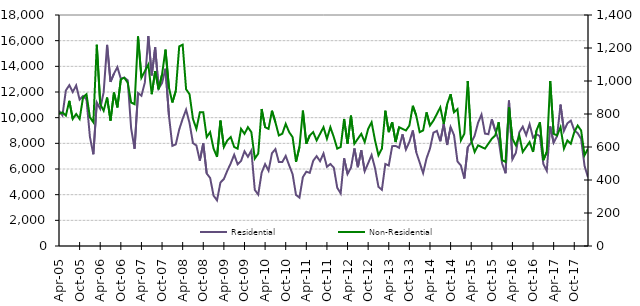
| Category | Residential |
|---|---|
| 2005-04-01 | 10540 |
| 2005-05-01 | 10180 |
| 2005-06-01 | 12120 |
| 2005-07-01 | 12530 |
| 2005-08-01 | 12000 |
| 2005-09-01 | 12510 |
| 2005-10-01 | 11410 |
| 2005-11-01 | 11690 |
| 2005-12-01 | 11430 |
| 2006-01-01 | 8500 |
| 2006-02-01 | 7150 |
| 2006-03-01 | 11180 |
| 2006-04-01 | 10690 |
| 2006-05-01 | 11990 |
| 2006-06-01 | 15670 |
| 2006-07-01 | 12790 |
| 2006-08-01 | 13430 |
| 2006-09-01 | 13930 |
| 2006-10-01 | 13030 |
| 2006-11-01 | 13120 |
| 2006-12-01 | 12920 |
| 2007-01-01 | 9170 |
| 2007-02-01 | 7580 |
| 2007-03-01 | 11920 |
| 2007-04-01 | 11700 |
| 2007-05-01 | 12750 |
| 2007-06-01 | 16360 |
| 2007-07-01 | 13290 |
| 2007-08-01 | 15480 |
| 2007-09-01 | 12270 |
| 2007-10-01 | 12700 |
| 2007-11-01 | 13810 |
| 2007-12-01 | 10180 |
| 2008-01-01 | 7800 |
| 2008-02-01 | 7920 |
| 2008-03-01 | 9080 |
| 2008-04-01 | 9910 |
| 2008-05-01 | 10620 |
| 2008-06-01 | 9580 |
| 2008-07-01 | 8020 |
| 2008-08-01 | 7830 |
| 2008-09-01 | 6650 |
| 2008-10-01 | 8000 |
| 2008-11-01 | 5650 |
| 2008-12-01 | 5300 |
| 2009-01-01 | 3920 |
| 2009-02-01 | 3560 |
| 2009-03-01 | 4950 |
| 2009-04-01 | 5220 |
| 2009-05-01 | 5870 |
| 2009-06-01 | 6440 |
| 2009-07-01 | 7110 |
| 2009-08-01 | 6370 |
| 2009-09-01 | 6630 |
| 2009-10-01 | 7380 |
| 2009-11-01 | 6950 |
| 2009-12-01 | 7440 |
| 2010-01-01 | 4370 |
| 2010-02-01 | 4010 |
| 2010-03-01 | 5720 |
| 2010-04-01 | 6380 |
| 2010-05-01 | 5870 |
| 2010-06-01 | 7230 |
| 2010-07-01 | 7550 |
| 2010-08-01 | 6540 |
| 2010-09-01 | 6540 |
| 2010-10-01 | 7020 |
| 2010-11-01 | 6290 |
| 2010-12-01 | 5600 |
| 2011-01-01 | 3980 |
| 2011-02-01 | 3770 |
| 2011-03-01 | 5370 |
| 2011-04-01 | 5790 |
| 2011-05-01 | 5700 |
| 2011-06-01 | 6640 |
| 2011-07-01 | 7000 |
| 2011-08-01 | 6610 |
| 2011-09-01 | 7210 |
| 2011-10-01 | 6170 |
| 2011-11-01 | 6390 |
| 2011-12-01 | 6110 |
| 2012-01-01 | 4540 |
| 2012-02-01 | 4100 |
| 2012-03-01 | 6830 |
| 2012-04-01 | 5610 |
| 2012-05-01 | 6110 |
| 2012-06-01 | 7600 |
| 2012-07-01 | 6140 |
| 2012-08-01 | 7460 |
| 2012-09-01 | 5830 |
| 2012-10-01 | 6450 |
| 2012-11-01 | 7090 |
| 2012-12-01 | 6070 |
| 2013-01-01 | 4610 |
| 2013-02-01 | 4380 |
| 2013-03-01 | 6390 |
| 2013-04-01 | 6270 |
| 2013-05-01 | 7780 |
| 2013-06-01 | 7800 |
| 2013-07-01 | 7650 |
| 2013-08-01 | 8700 |
| 2013-09-01 | 7520 |
| 2013-10-01 | 8110 |
| 2013-11-01 | 9000 |
| 2013-12-01 | 7310 |
| 2014-01-01 | 6500 |
| 2014-02-01 | 5680 |
| 2014-03-01 | 6830 |
| 2014-04-01 | 7590 |
| 2014-05-01 | 8830 |
| 2014-06-01 | 8970 |
| 2014-07-01 | 8160 |
| 2014-08-01 | 9500 |
| 2014-09-01 | 7870 |
| 2014-10-01 | 9270 |
| 2014-11-01 | 8640 |
| 2014-12-01 | 6590 |
| 2015-01-01 | 6270 |
| 2015-02-01 | 5260 |
| 2015-03-01 | 7700 |
| 2015-04-01 | 8060 |
| 2015-05-01 | 8600 |
| 2015-06-01 | 9610 |
| 2015-07-01 | 10240 |
| 2015-08-01 | 8760 |
| 2015-09-01 | 8710 |
| 2015-10-01 | 9880 |
| 2015-11-01 | 9000 |
| 2015-12-01 | 8230 |
| 2016-01-01 | 6430 |
| 2016-02-01 | 5670 |
| 2016-03-01 | 11330 |
| 2016-04-01 | 6760 |
| 2016-05-01 | 7260 |
| 2016-06-01 | 8860 |
| 2016-07-01 | 9300 |
| 2016-08-01 | 8640 |
| 2016-09-01 | 9490 |
| 2016-10-01 | 8440 |
| 2016-11-01 | 8710 |
| 2016-12-01 | 8560 |
| 2017-01-01 | 6400 |
| 2017-02-01 | 5860 |
| 2017-03-01 | 9320 |
| 2017-04-01 | 8050 |
| 2017-05-01 | 8570 |
| 2017-06-01 | 11020 |
| 2017-07-01 | 8970 |
| 2017-08-01 | 9560 |
| 2017-09-01 | 9770 |
| 2017-10-01 | 9020 |
| 2017-11-01 | 8790 |
| 2017-12-01 | 8350 |
| 2018-01-01 | 6240 |
| 2018-02-01 | 5350 |